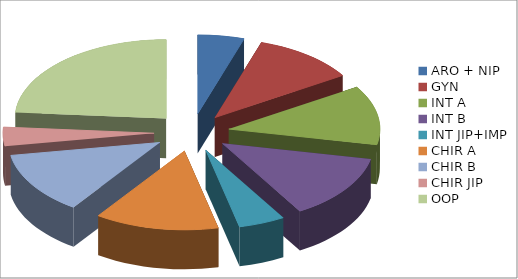
| Category | Series 0 | Series 1 | Series 2 | Series 3 | Series 4 | Series 5 | Series 6 | Series 7 |
|---|---|---|---|---|---|---|---|---|
| ARO + NIP | 9 | 38 | 38 | 12 | 0.316 | 0.316 | 7 | 0.184 |
| GYN | 20 | 81 | 1 | 0 | 0 | 0 | 0 | 0 |
| INT A | 22 | 235 | 95 | 19 | 0.081 | 0.2 | 3 | 0.013 |
| INT B | 24 | 253 | 103 | 24 | 0.095 | 0.233 | 2 | 0.008 |
| INT JIP+IMP | 9 | 81 | 29 | 5 | 0.062 | 0.172 | 2 | 0.025 |
| CHIR A | 24 | 216 | 54 | 4 | 0.019 | 0.074 | 3 | 0.056 |
| CHIR B | 23 | 156 | 72 | 6 | 0.038 | 0.083 | 0 | 0 |
| CHIR JIP | 7 | 78 | 52 | 3 | 0.038 | 0.058 | 0 | 0 |
| OOP | 43 | 388 | 317 | 145 | 0.374 | 0.457 | 47 | 0.121 |